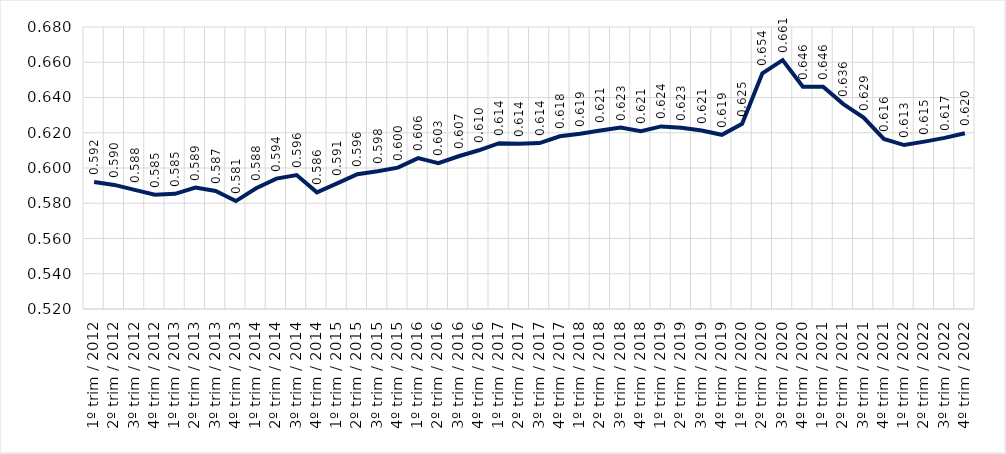
| Category | Conjunto RMs |
|---|---|
| 1º trim / 2012 | 0.592 |
| 2º trim / 2012 | 0.59 |
| 3º trim / 2012 | 0.588 |
| 4º trim / 2012 | 0.585 |
| 1º trim / 2013 | 0.585 |
| 2º trim / 2013 | 0.589 |
| 3º trim / 2013 | 0.587 |
| 4º trim / 2013 | 0.581 |
| 1º trim / 2014 | 0.588 |
| 2º trim / 2014 | 0.594 |
| 3º trim / 2014 | 0.596 |
| 4º trim / 2014 | 0.586 |
| 1º trim / 2015 | 0.591 |
| 2º trim / 2015 | 0.596 |
| 3º trim / 2015 | 0.598 |
| 4º trim / 2015 | 0.6 |
| 1º trim / 2016 | 0.606 |
| 2º trim / 2016 | 0.603 |
| 3º trim / 2016 | 0.607 |
| 4º trim / 2016 | 0.61 |
| 1º trim / 2017 | 0.614 |
| 2º trim / 2017 | 0.614 |
| 3º trim / 2017 | 0.614 |
| 4º trim / 2017 | 0.618 |
| 1º trim / 2018 | 0.619 |
| 2º trim / 2018 | 0.621 |
| 3º trim / 2018 | 0.623 |
| 4º trim / 2018 | 0.621 |
| 1º trim / 2019 | 0.624 |
| 2º trim / 2019 | 0.623 |
| 3º trim / 2019 | 0.621 |
| 4º trim / 2019 | 0.619 |
| 1º trim / 2020 | 0.625 |
| 2º trim / 2020 | 0.654 |
| 3º trim / 2020 | 0.661 |
| 4º trim / 2020 | 0.646 |
| 1º trim / 2021 | 0.646 |
| 2º trim / 2021 | 0.636 |
| 3º trim / 2021 | 0.629 |
| 4º trim / 2021 | 0.616 |
| 1º trim / 2022 | 0.613 |
| 2º trim / 2022 | 0.615 |
| 3º trim / 2022 | 0.617 |
| 4º trim / 2022 | 0.62 |